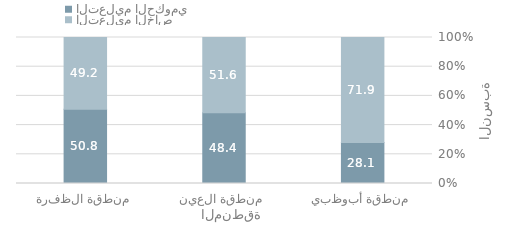
| Category | التعليم الحكومي | التعليم الخاص |
|---|---|---|
| منطقة أبوظبي | 28.056 | 71.944 |
| منطقة العين | 48.395 | 51.605 |
| منطقة الظفرة | 50.816 | 49.184 |